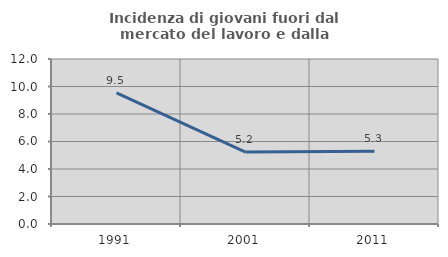
| Category | Incidenza di giovani fuori dal mercato del lavoro e dalla formazione  |
|---|---|
| 1991.0 | 9.534 |
| 2001.0 | 5.234 |
| 2011.0 | 5.285 |